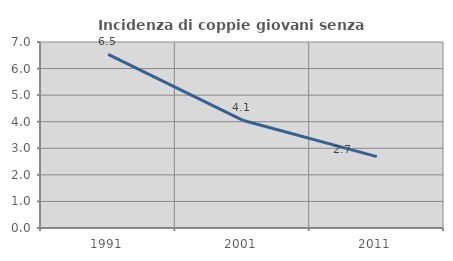
| Category | Incidenza di coppie giovani senza figli |
|---|---|
| 1991.0 | 6.538 |
| 2001.0 | 4.057 |
| 2011.0 | 2.685 |